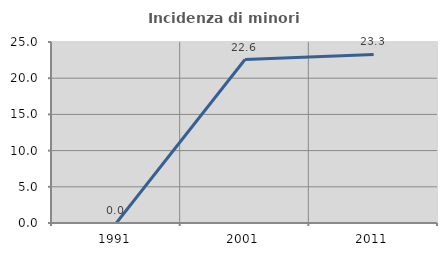
| Category | Incidenza di minori stranieri |
|---|---|
| 1991.0 | 0 |
| 2001.0 | 22.581 |
| 2011.0 | 23.276 |